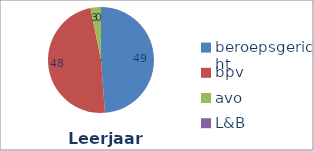
| Category | Series 0 |
|---|---|
| beroepsgericht | 48.805 |
| bpv | 48.008 |
| avo | 3.188 |
| L&B | 0 |